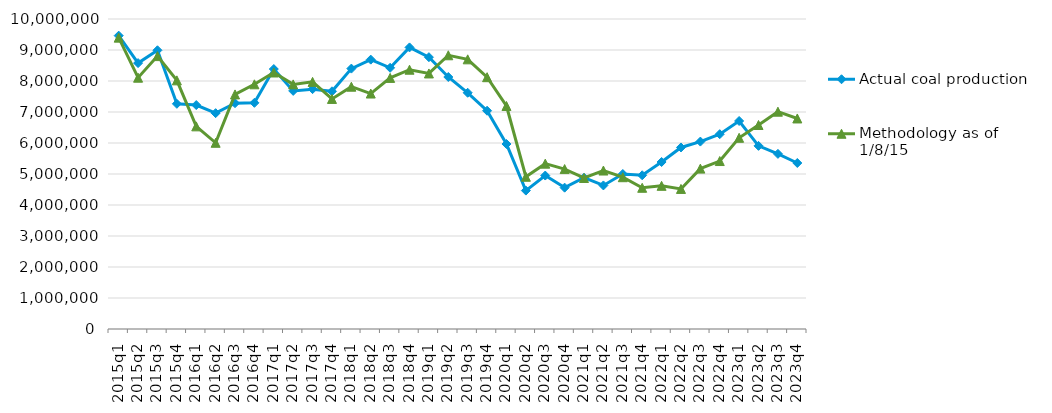
| Category | Actual coal production | Methodology as of 1/8/15 |
|---|---|---|
| 2015q1 | 9462775 | 9399132 |
| 2015q2 | 8577301 | 8106216 |
| 2015q3 | 8990977 | 8803068 |
| 2015q4 | 7264391 | 8020916 |
| 2016q1 | 7223910 | 6536980 |
| 2016q2 | 6962844 | 6006774 |
| 2016q3 | 7284254 | 7567414 |
| 2016q4 | 7295697 | 7893242 |
| 2017q1 | 8385928 | 8274426 |
| 2017q2 | 7680778 | 7890834 |
| 2017q3 | 7737537 | 7971635 |
| 2017q4 | 7667624 | 7421478 |
| 2018q1 | 8399886 | 7815890 |
| 2018q2 | 8689323 | 7595271 |
| 2018q3 | 8425763 | 8099945 |
| 2018q4 | 9083235 | 8364075 |
| 2019q1 | 8768758 | 8243287 |
| 2019q2 | 8128785 | 8829890 |
| 2019q3 | 7620038 | 8698818 |
| 2019q4 | 7041071 | 8122783 |
| 2020q1 | 5967021 | 7193745 |
| 2020q2 | 4464979 | 4910736 |
| 2020q3 | 4950566 | 5333289 |
| 2020q4 | 4559879 | 5158905 |
| 2021q1 | 4879870 | 4871565 |
| 2021q2 | 4631472 | 5111611 |
| 2021q3 | 5000343 | 4896611 |
| 2021q4 | 4958751 | 4555332 |
| 2022q1 | 5386701 | 4618752 |
| 2022q2 | 5856157 | 4518279 |
| 2022q3 | 6045721 | 5173609 |
| 2022q4 | 6284560 | 5418173 |
| 2023q1 | 6710568 | 6167357 |
| 2023q2 | 5907432 | 6580534 |
| 2023q3 | 5649626 | 7009593 |
| 2023q4 | 5355029 | 6791408 |